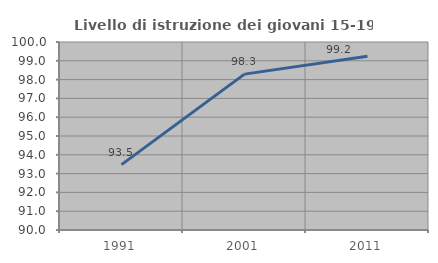
| Category | Livello di istruzione dei giovani 15-19 anni |
|---|---|
| 1991.0 | 93.478 |
| 2001.0 | 98.291 |
| 2011.0 | 99.24 |